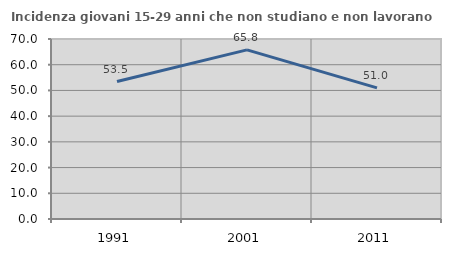
| Category | Incidenza giovani 15-29 anni che non studiano e non lavorano  |
|---|---|
| 1991.0 | 53.456 |
| 2001.0 | 65.761 |
| 2011.0 | 50.991 |